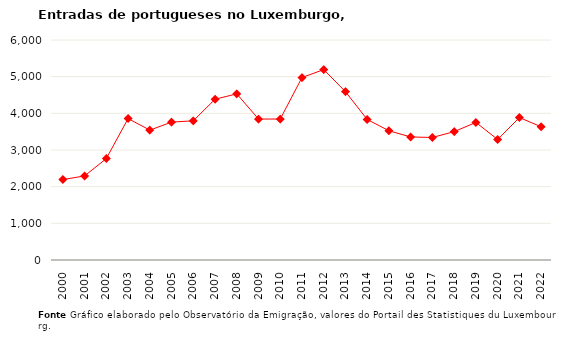
| Category | Entradas |
|---|---|
| 2000.0 | 2193 |
| 2001.0 | 2293 |
| 2002.0 | 2767 |
| 2003.0 | 3857 |
| 2004.0 | 3542 |
| 2005.0 | 3761 |
| 2006.0 | 3796 |
| 2007.0 | 4385 |
| 2008.0 | 4531 |
| 2009.0 | 3844 |
| 2010.0 | 3845 |
| 2011.0 | 4977 |
| 2012.0 | 5193 |
| 2013.0 | 4590 |
| 2014.0 | 3832 |
| 2015.0 | 3525 |
| 2016.0 | 3355 |
| 2017.0 | 3342 |
| 2018.0 | 3501 |
| 2019.0 | 3752 |
| 2020.0 | 3286 |
| 2021.0 | 3885 |
| 2022.0 | 3633 |